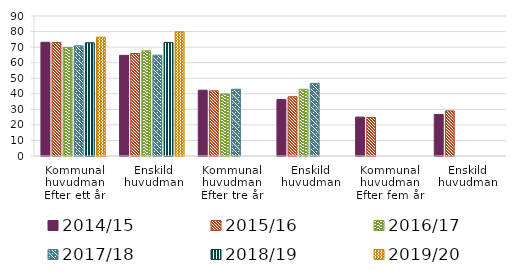
| Category | 2014/15 | 2015/16 | 2016/17 | 2017/18 | 2018/19 | 2019/20 |
|---|---|---|---|---|---|---|
| 0 | 73.1 | 73 | 69.8 | 70.8 | 72.8 | 76.4 |
| 1 | 64.7 | 65.9 | 67.6 | 64.8 | 73 | 79.8 |
| 2 | 42.3 | 41.9 | 39.9 | 42.9 | 0 | 0 |
| 3 | 36.3 | 38.1 | 42.9 | 46.7 | 0 | 0 |
| 4 | 25 | 24.8 | 0 | 0 | 0 | 0 |
| 5 | 26.7 | 29 | 0 | 0 | 0 | 0 |